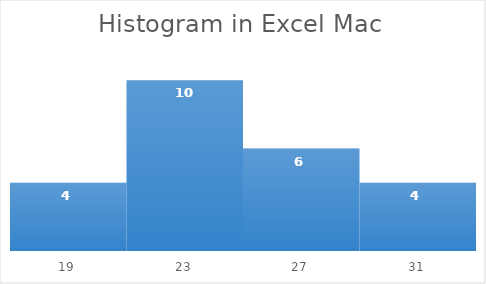
| Category | Frequency |
|---|---|
| 19.0 | 4 |
| 23.0 | 10 |
| 27.0 | 6 |
| 31.0 | 4 |